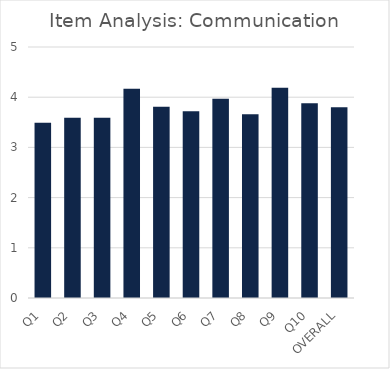
| Category | Series 0 |
|---|---|
| Q1 | 3.49 |
| Q2 | 3.59 |
| Q3 | 3.59 |
| Q4 | 4.17 |
| Q5 | 3.81 |
| Q6 | 3.72 |
| Q7 | 3.97 |
| Q8 | 3.66 |
| Q9 | 4.19 |
| Q10 | 3.88 |
| OVERALL | 3.8 |